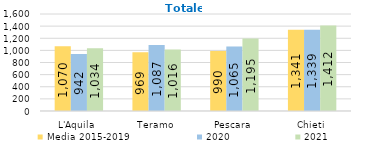
| Category | Media 2015-2019  | 2020 | 2021 |
|---|---|---|---|
| L'Aquila | 1069.8 | 942 | 1034 |
| Teramo | 968.8 | 1087 | 1016 |
| Pescara | 990.4 | 1065 | 1195 |
| Chieti | 1340.6 | 1339 | 1412 |